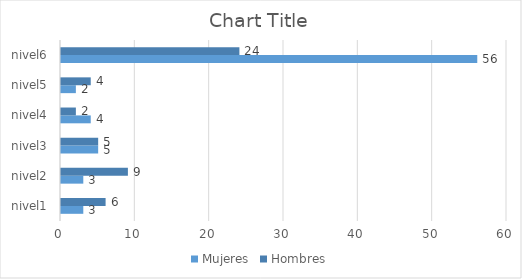
| Category | Mujeres | Hombres |
|---|---|---|
| nivel1 | 3 | 6 |
| nivel2 | 3 | 9 |
| nivel3 | 5 | 5 |
| nivel4 | 4 | 2 |
| nivel5 | 2 | 4 |
| nivel6 | 56 | 24 |